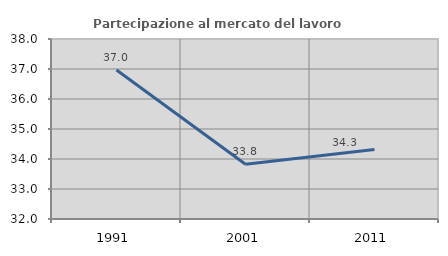
| Category | Partecipazione al mercato del lavoro  femminile |
|---|---|
| 1991.0 | 36.964 |
| 2001.0 | 33.823 |
| 2011.0 | 34.319 |